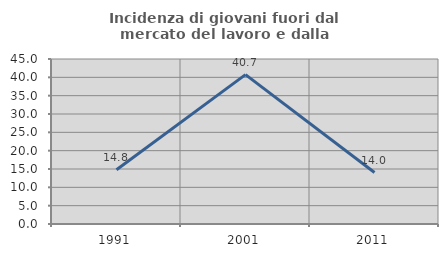
| Category | Incidenza di giovani fuori dal mercato del lavoro e dalla formazione  |
|---|---|
| 1991.0 | 14.783 |
| 2001.0 | 40.741 |
| 2011.0 | 14.045 |